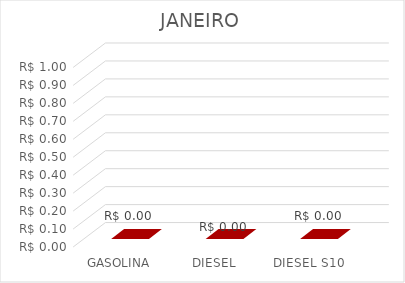
| Category | JANEIRO |
|---|---|
| GASOLINA | 0 |
| DIESEL | 0 |
| DIESEL S10 | 0 |